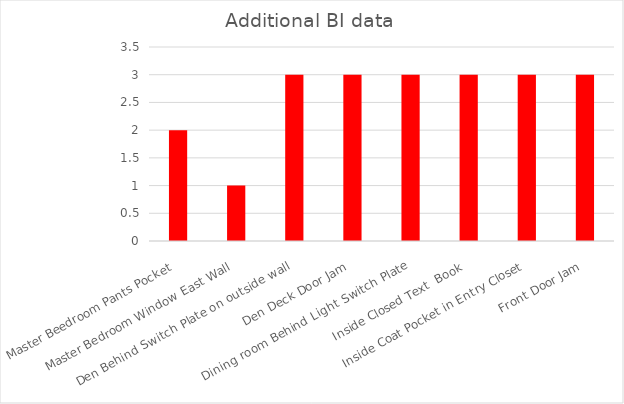
| Category | Series 0 |
|---|---|
| Master Beedroom Pants Pocket | 2 |
| Master Bedroom Window East Wall | 1 |
| Den Behind Switch Plate on outside wall | 3 |
| Den Deck Door Jam | 3 |
| Dining room Behind Light Switch Plate | 3 |
| Inside Closed Text  Book | 3 |
| Inside Coat Pocket in Entry Closet | 3 |
| Front Door Jam | 3 |